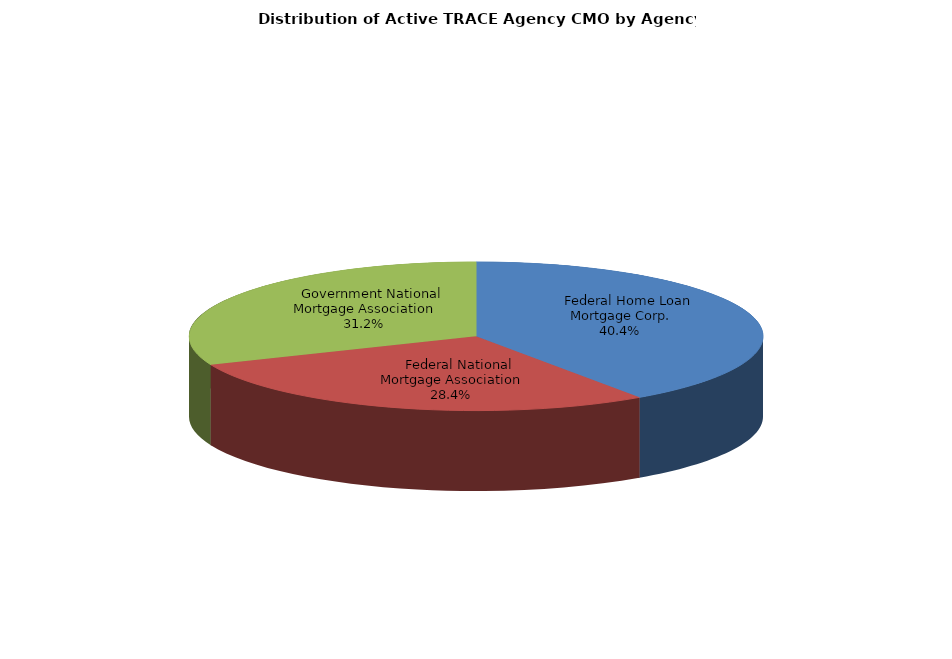
| Category | Series 0 |
|---|---|
|     Federal Home Loan Mortgage Corp. | 83359 |
|     Federal National Mortgage Association | 58636 |
|     Government National Mortgage Association | 64539 |